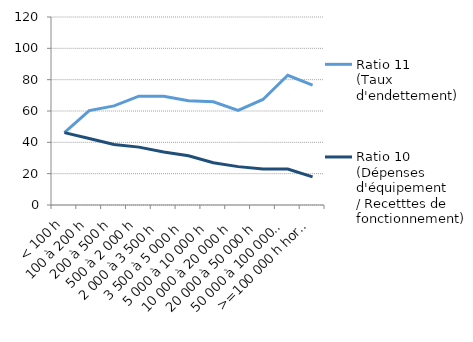
| Category | Ratio 11
(Taux d'endettement) | Ratio 10 
(Dépenses d'équipement
/ Recetttes de fonctionnement) |
|---|---|---|
| < 100 h | 46.235 | 46.185 |
| 100 à 200 h | 60.251 | 42.472 |
| 200 à 500 h | 63.275 | 38.575 |
| 500 à 2 000 h | 69.453 | 36.939 |
| 2 000 à 3 500 h | 69.472 | 33.806 |
| 3 500 à 5 000 h | 66.534 | 31.395 |
| 5 000 à 10 000 h | 65.834 | 27.013 |
| 10 000 à 20 000 h | 60.417 | 24.493 |
| 20 000 à 50 000 h | 67.368 | 23.055 |
| 50 000 à 100 000 h | 82.811 | 22.933 |
| >=100 000 h hors Paris | 76.565 | 17.93 |